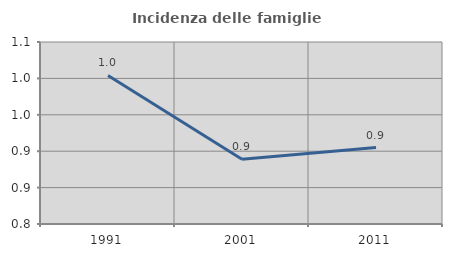
| Category | Incidenza delle famiglie numerose |
|---|---|
| 1991.0 | 1.004 |
| 2001.0 | 0.889 |
| 2011.0 | 0.905 |